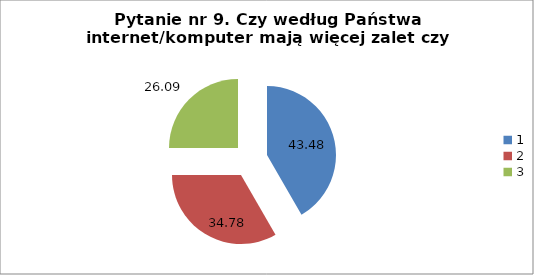
| Category | % |
|---|---|
| 0 | 43.478 |
| 1 | 34.783 |
| 2 | 26.087 |